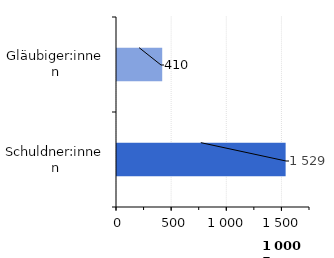
| Category | Series 0 |
|---|---|
| Gläubiger:innen | 410 |
| Schuldner:innen | 1529 |